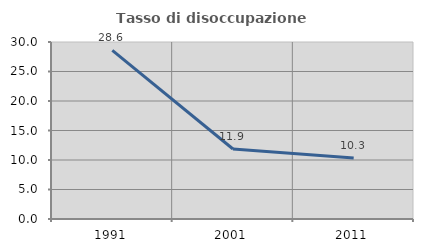
| Category | Tasso di disoccupazione giovanile  |
|---|---|
| 1991.0 | 28.571 |
| 2001.0 | 11.864 |
| 2011.0 | 10.345 |